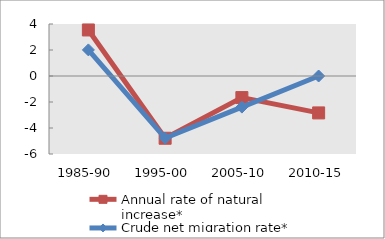
| Category | Annual rate of natural increase* | Crude net migration rate* |
|---|---|---|
| 1985-90 | 3.542 | 2.008 |
| 1995-00 | -4.789 | -4.779 |
| 2005-10 | -1.661 | -2.392 |
| 2010-15 | -2.839 | 0 |